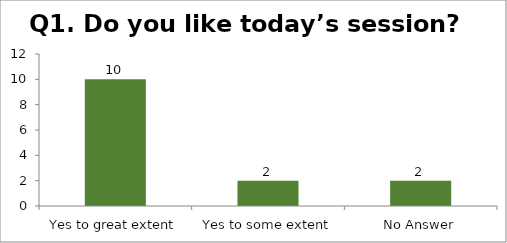
| Category | Q1. Do you like today’s session? |
|---|---|
| Yes to great extent | 10 |
| Yes to some extent | 2 |
| No Answer | 2 |